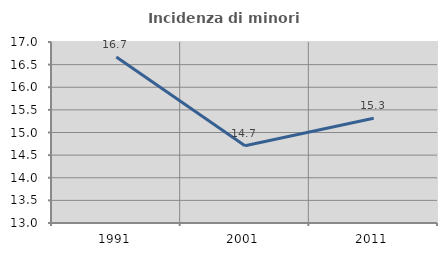
| Category | Incidenza di minori stranieri |
|---|---|
| 1991.0 | 16.667 |
| 2001.0 | 14.706 |
| 2011.0 | 15.315 |